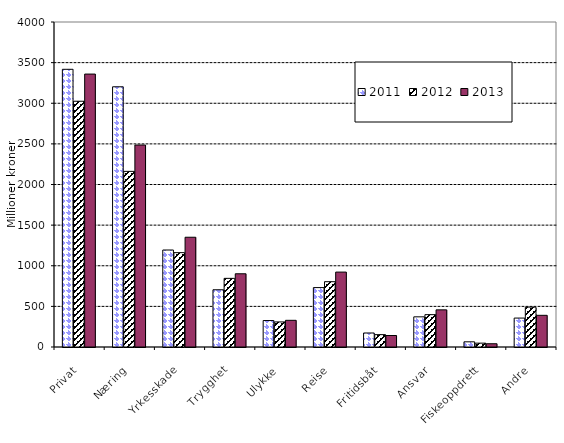
| Category | 2011 | 2012 | 2013 |
|---|---|---|---|
| Privat | 3417.852 | 3024.751 | 3359.064 |
| Næring | 3202.621 | 2161.71 | 2485.733 |
| Yrkesskade | 1193.79 | 1161.303 | 1350.935 |
| Trygghet | 704.479 | 844.894 | 901.239 |
| Ulykke | 325.712 | 308.504 | 328.451 |
| Reise | 731.293 | 803.759 | 922 |
| Fritidsbåt | 172.312 | 152.304 | 141.471 |
| Ansvar | 371.298 | 398.264 | 457.186 |
| Fiskeoppdrett | 63.655 | 47.461 | 40.037 |
| Andre | 356.04 | 491.117 | 389.969 |